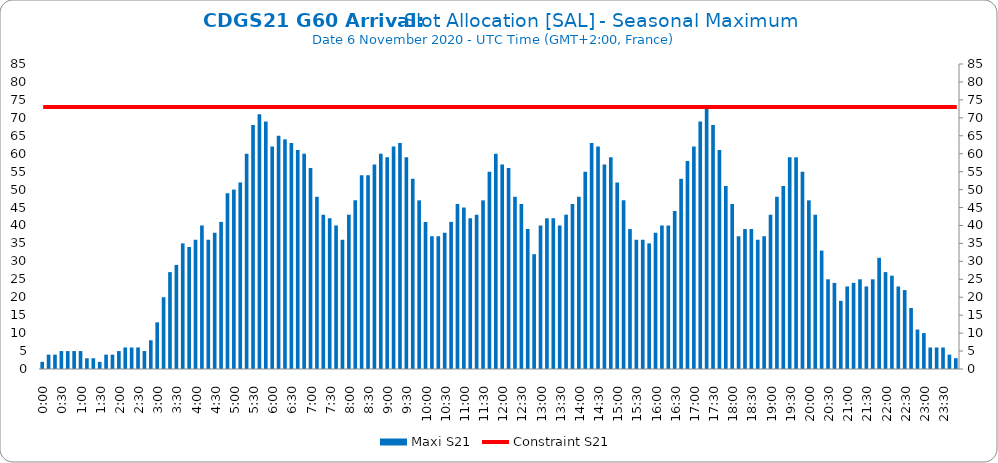
| Category | Maxi S21 |
|---|---|
| 0.0 | 2 |
| 0.006944444444444444 | 4 |
| 0.013888888888888888 | 4 |
| 0.020833333333333332 | 5 |
| 0.027777777777777776 | 5 |
| 0.034722222222222224 | 5 |
| 0.041666666666666664 | 5 |
| 0.04861111111111111 | 3 |
| 0.05555555555555555 | 3 |
| 0.0625 | 2 |
| 0.06944444444444443 | 4 |
| 0.0763888888888889 | 4 |
| 0.08333333333333333 | 5 |
| 0.09027777777777778 | 6 |
| 0.09722222222222222 | 6 |
| 0.10416666666666667 | 6 |
| 0.1111111111111111 | 5 |
| 0.11805555555555557 | 8 |
| 0.125 | 13 |
| 0.13194444444444445 | 20 |
| 0.1388888888888889 | 27 |
| 0.14583333333333334 | 29 |
| 0.15277777777777776 | 35 |
| 0.15972222222222224 | 34 |
| 0.16666666666666666 | 36 |
| 0.17361111111111113 | 40 |
| 0.18055555555555555 | 36 |
| 0.1875 | 38 |
| 0.19444444444444445 | 41 |
| 0.20138888888888887 | 49 |
| 0.20833333333333334 | 50 |
| 0.2152777777777778 | 52 |
| 0.2222222222222222 | 60 |
| 0.22916666666666666 | 68 |
| 0.23611111111111113 | 71 |
| 0.24305555555555555 | 69 |
| 0.25 | 62 |
| 0.2569444444444445 | 65 |
| 0.2638888888888889 | 64 |
| 0.2708333333333333 | 63 |
| 0.2777777777777778 | 61 |
| 0.2847222222222222 | 60 |
| 0.2916666666666667 | 56 |
| 0.2986111111111111 | 48 |
| 0.3055555555555555 | 43 |
| 0.3125 | 42 |
| 0.3194444444444445 | 40 |
| 0.3263888888888889 | 36 |
| 0.3333333333333333 | 43 |
| 0.34027777777777773 | 47 |
| 0.34722222222222227 | 54 |
| 0.3541666666666667 | 54 |
| 0.3611111111111111 | 57 |
| 0.3680555555555556 | 60 |
| 0.375 | 59 |
| 0.3819444444444444 | 62 |
| 0.3888888888888889 | 63 |
| 0.3958333333333333 | 59 |
| 0.40277777777777773 | 53 |
| 0.40972222222222227 | 47 |
| 0.4166666666666667 | 41 |
| 0.4236111111111111 | 37 |
| 0.4305555555555556 | 37 |
| 0.4375 | 38 |
| 0.4444444444444444 | 41 |
| 0.4513888888888889 | 46 |
| 0.4583333333333333 | 45 |
| 0.46527777777777773 | 42 |
| 0.47222222222222227 | 43 |
| 0.4791666666666667 | 47 |
| 0.4861111111111111 | 55 |
| 0.4930555555555556 | 60 |
| 0.5 | 57 |
| 0.5069444444444444 | 56 |
| 0.513888888888889 | 48 |
| 0.5208333333333334 | 46 |
| 0.5277777777777778 | 39 |
| 0.5347222222222222 | 32 |
| 0.5416666666666666 | 40 |
| 0.548611111111111 | 42 |
| 0.5555555555555556 | 42 |
| 0.5625 | 40 |
| 0.5694444444444444 | 43 |
| 0.576388888888889 | 46 |
| 0.5833333333333334 | 48 |
| 0.5902777777777778 | 55 |
| 0.5972222222222222 | 63 |
| 0.6041666666666666 | 62 |
| 0.611111111111111 | 57 |
| 0.6180555555555556 | 59 |
| 0.625 | 52 |
| 0.6319444444444444 | 47 |
| 0.638888888888889 | 39 |
| 0.6458333333333334 | 36 |
| 0.6527777777777778 | 36 |
| 0.6597222222222222 | 35 |
| 0.6666666666666666 | 38 |
| 0.6736111111111112 | 40 |
| 0.6805555555555555 | 40 |
| 0.6875 | 44 |
| 0.6944444444444445 | 53 |
| 0.7013888888888888 | 58 |
| 0.7083333333333334 | 62 |
| 0.7152777777777778 | 69 |
| 0.7222222222222222 | 73 |
| 0.7291666666666666 | 68 |
| 0.7361111111111112 | 61 |
| 0.7430555555555555 | 51 |
| 0.75 | 46 |
| 0.7569444444444445 | 37 |
| 0.7638888888888888 | 39 |
| 0.7708333333333334 | 39 |
| 0.7777777777777778 | 36 |
| 0.7847222222222222 | 37 |
| 0.7916666666666666 | 43 |
| 0.7986111111111112 | 48 |
| 0.8055555555555555 | 51 |
| 0.8125 | 59 |
| 0.8194444444444445 | 59 |
| 0.8263888888888888 | 55 |
| 0.8333333333333334 | 47 |
| 0.8402777777777778 | 43 |
| 0.8472222222222222 | 33 |
| 0.8541666666666666 | 25 |
| 0.8611111111111112 | 24 |
| 0.8680555555555555 | 19 |
| 0.875 | 23 |
| 0.8819444444444445 | 24 |
| 0.8888888888888888 | 25 |
| 0.8958333333333334 | 23 |
| 0.9027777777777778 | 25 |
| 0.9097222222222222 | 31 |
| 0.9166666666666666 | 27 |
| 0.9236111111111112 | 26 |
| 0.9305555555555555 | 23 |
| 0.9375 | 22 |
| 0.9444444444444445 | 17 |
| 0.9513888888888888 | 11 |
| 0.9583333333333334 | 10 |
| 0.9652777777777778 | 6 |
| 0.9722222222222222 | 6 |
| 0.9791666666666666 | 6 |
| 0.9861111111111112 | 4 |
| 0.9930555555555555 | 3 |